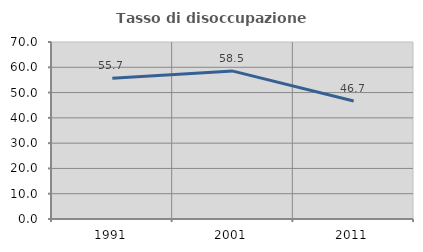
| Category | Tasso di disoccupazione giovanile  |
|---|---|
| 1991.0 | 55.66 |
| 2001.0 | 58.491 |
| 2011.0 | 46.667 |